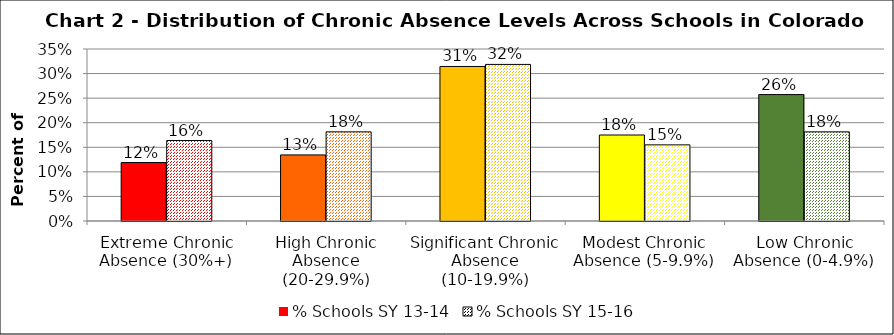
| Category | % Schools SY 13-14 | % Schools SY 15-16 |
|---|---|---|
| Extreme Chronic Absence (30%+) | 0.119 | 0.164 |
| High Chronic Absence (20-29.9%) | 0.134 | 0.181 |
| Significant Chronic Absence (10-19.9%) | 0.314 | 0.319 |
| Modest Chronic Absence (5-9.9%) | 0.175 | 0.155 |
| Low Chronic Absence (0-4.9%) | 0.257 | 0.181 |